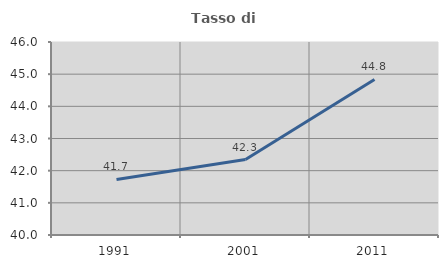
| Category | Tasso di occupazione   |
|---|---|
| 1991.0 | 41.727 |
| 2001.0 | 42.344 |
| 2011.0 | 44.834 |